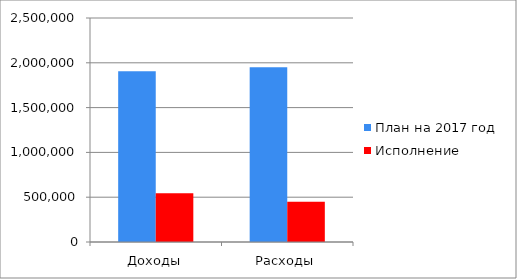
| Category | План на 2017 год | Исполнение |
|---|---|---|
| Доходы | 1904908 | 544657 |
| Расходы | 1951467 | 448128 |